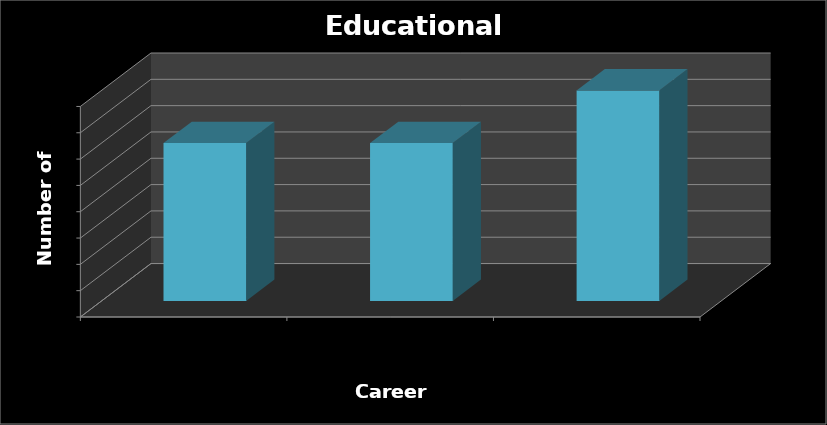
| Category | Series 0 |
|---|---|
| Speech Pathologists | 6 |
| Occupational Therapists | 6 |
| Clinical or Counseling Psychologists | 8 |